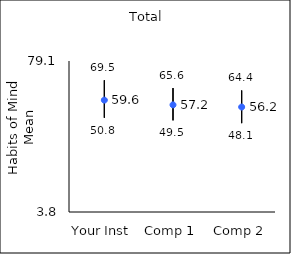
| Category | 25th percentile | 75th percentile | Mean |
|---|---|---|---|
| Your Inst | 50.8 | 69.5 | 59.59 |
| Comp 1 | 49.5 | 65.6 | 57.23 |
| Comp 2 | 48.1 | 64.4 | 56.15 |